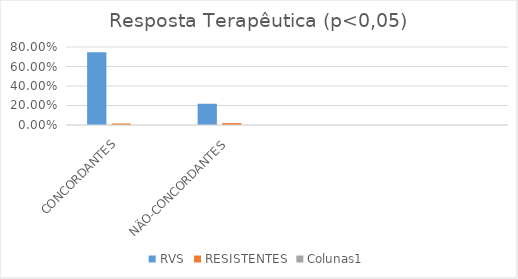
| Category | RVS | RESISTENTES | Colunas1 |
|---|---|---|---|
| CONCORDANTES | 0.746 | 0.016 |  |
| NÃO-CONCORDANTES | 0.218 | 0.02 |  |